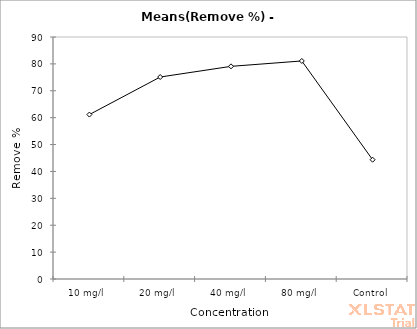
| Category | Series 0 |
|---|---|
| 10 mg/l | 61.154 |
| 20 mg/l | 75.115 |
| 40 mg/l | 79.085 |
| 80 mg/l | 81.087 |
| Control | 44.36 |